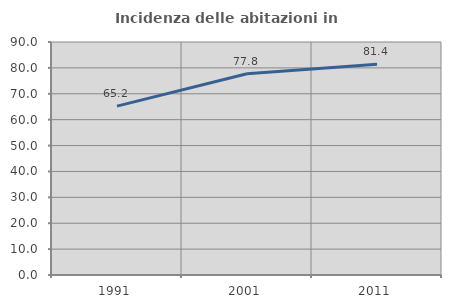
| Category | Incidenza delle abitazioni in proprietà  |
|---|---|
| 1991.0 | 65.245 |
| 2001.0 | 77.764 |
| 2011.0 | 81.368 |